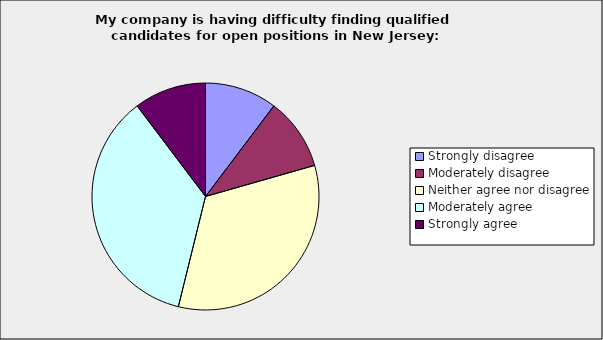
| Category | Series 0 |
|---|---|
| Strongly disagree | 0.103 |
| Moderately disagree | 0.103 |
| Neither agree nor disagree | 0.333 |
| Moderately agree | 0.359 |
| Strongly agree | 0.103 |